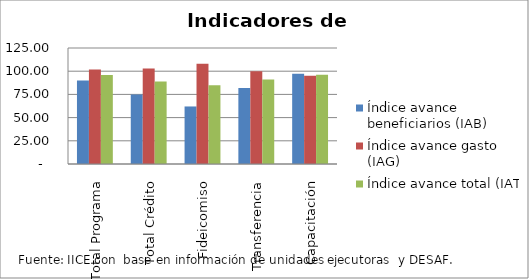
| Category | Índice avance beneficiarios (IAB)  | Índice avance gasto (IAG) | Índice avance total (IAT)  |
|---|---|---|---|
| Total Programa | 90.05 | 101.778 | 95.914 |
| Total Crédito | 74.79 | 102.848 | 88.819 |
| Fideicomiso | 62 | 107.905 | 84.953 |
| Transferencia | 81.989 | 100.001 | 90.995 |
| Capacitación | 97.314 | 95.098 | 96.206 |